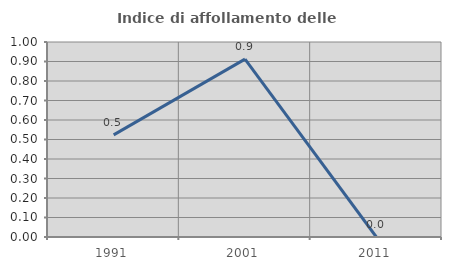
| Category | Indice di affollamento delle abitazioni  |
|---|---|
| 1991.0 | 0.524 |
| 2001.0 | 0.912 |
| 2011.0 | 0 |